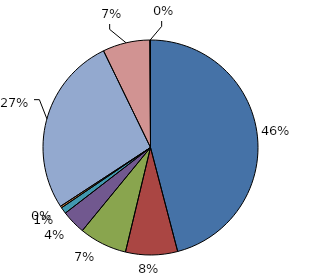
| Category | DIHR |
|---|---|
| Eau | 1559963505 |
| Aménagement de Zones, Lotissement, Ateliers | 265410791 |
| Économie | 244214678 |
| Tourisme-Culture-Sport | 122805559 |
| Santé-Social | 32952265 |
| Scolaire | 9161461 |
| Transport | 917389332 |
| Ordures | 241255075 |
| Administration | 3259269 |